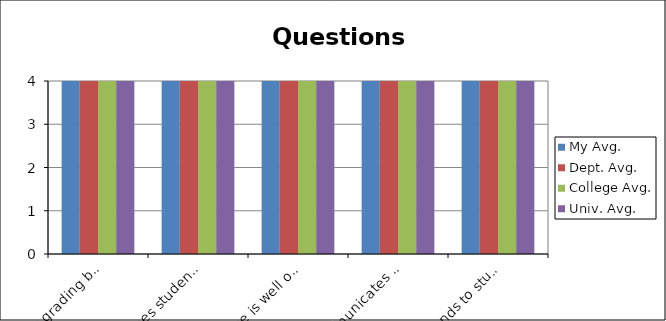
| Category | My Avg. | Dept. Avg. | College Avg. | Univ. Avg. |
|---|---|---|---|---|
| Clear grading basis | 4 | 4 | 4 | 4 |
| Engages students in subject matter | 4 | 4 | 4 | 4 |
| Course is well organized. | 4 | 4 | 4 | 4 |
| Communicates subject matter clearly | 4 | 4 | 4 | 4 |
| Responds to students’ questions | 4 | 4 | 4 | 4 |